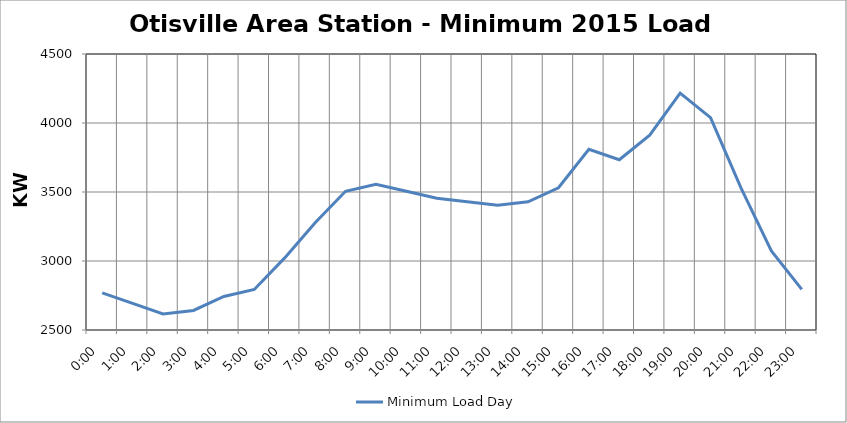
| Category | Minimum Load Day |
|---|---|
| 0.0 | 2768.6 |
| 0.041666666666666664 | 2692.4 |
| 0.08333333333333333 | 2616.2 |
| 0.125 | 2641.6 |
| 0.16666666666666666 | 2743.2 |
| 0.20833333333333334 | 2794 |
| 0.25 | 3022.6 |
| 0.2916666666666667 | 3276.6 |
| 0.3333333333333333 | 3505.2 |
| 0.375 | 3556 |
| 0.4166666666666667 | 3505.2 |
| 0.4583333333333333 | 3454.4 |
| 0.5 | 3429 |
| 0.5416666666666666 | 3403.6 |
| 0.5833333333333334 | 3429 |
| 0.625 | 3530.6 |
| 0.6666666666666666 | 3810 |
| 0.7083333333333334 | 3733.8 |
| 0.75 | 3911.6 |
| 0.7916666666666666 | 4216.4 |
| 0.8333333333333334 | 4038.6 |
| 0.875 | 3530.6 |
| 0.9166666666666666 | 3073.4 |
| 0.9583333333333334 | 2794 |